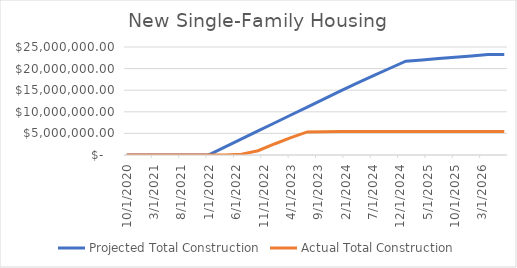
| Category | Projected Total Construction | Actual Total Construction |
|---|---|---|
| 10/1/20 | 0 | 0 |
| 1/1/21 | 0 | 0 |
| 4/1/21 | 8587.688 | 0 |
| 7/1/21 | 17175.377 | 0 |
| 10/1/21 | 25763.065 | 0 |
| 1/1/22 | 34350.753 | 0 |
| 4/1/22 | 1878699.21 | 0 |
| 7/1/22 | 3723047.666 | 197181 |
| 10/1/22 | 5567396.122 | 986822 |
| 1/1/23 | 7411744.578 | 2549834 |
| 4/1/23 | 9256093.034 | 4013019.09 |
| 7/1/23 | 11100441.491 | 5350329.15 |
| 10/1/23 | 12944789.947 | 5387412.73 |
| 1/1/24 | 14789138.403 | 5461333.54 |
| 4/1/24 | 16556923.046 | 5461333.54 |
| 7/1/24 | 18311425.133 | 5461333.54 |
| 10/1/24 | 20023747.221 | 5461333.54 |
| 1/1/25 | 21708536.672 | 5461333.54 |
| 4/1/25 | 22015126.789 | 5461333.54 |
| 7/1/25 | 22321716.907 | 5461333.54 |
| 10/1/25 | 22628307.025 | 5461333.54 |
| 1/1/26 | 22934897.142 | 5461333.54 |
| 4/1/26 | 23241487.26 | 5461333.54 |
| 7/1/26 | 23241487.26 | 5461333.54 |